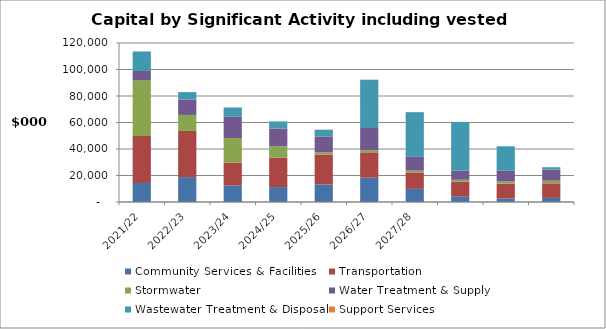
| Category | Community Services & Facilities | Transportation | Stormwater | Water Treatment & Supply | Wastewater Treatment & Disposal | Support Services |
|---|---|---|---|---|---|---|
| 2021/22 | 14355 | 35472 | 41977 | 7092 | 14724 |  |
| 2022/23 | 18782 | 34834 | 12087 | 11587 | 5651 |  |
| 2023/24 | 12349 | 17318 | 18592 | 16060 | 6990 |  |
| 2024/25 | 11260 | 22320 | 8376 | 13490 | 5359 |  |
| 2025/26 | 13269 | 22458 | 1744 | 12005 | 5103 |  |
| 2026/27 | 18326 | 19160 | 1508 | 16849 | 36483 |  |
| 2027/28 | 9893 | 12418 | 1413 | 10332 | 33741 |  |